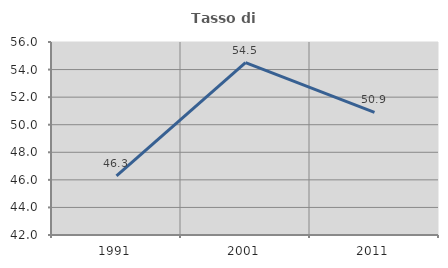
| Category | Tasso di occupazione   |
|---|---|
| 1991.0 | 46.296 |
| 2001.0 | 54.51 |
| 2011.0 | 50.901 |